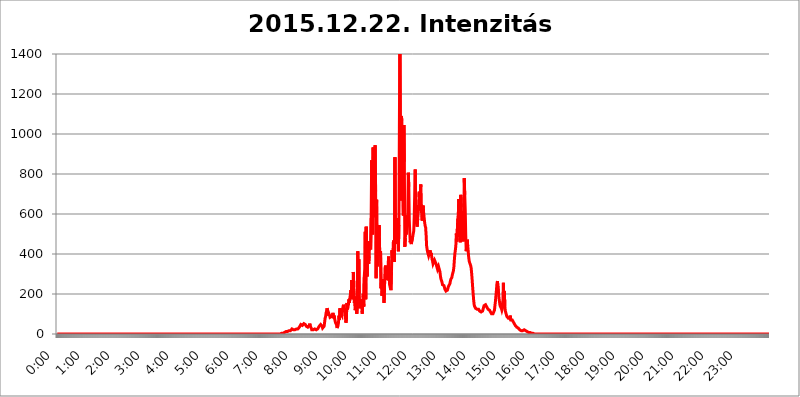
| Category | 2015.12.22. Intenzitás [W/m^2] |
|---|---|
| 0.0 | 0 |
| 0.0006944444444444445 | 0 |
| 0.001388888888888889 | 0 |
| 0.0020833333333333333 | 0 |
| 0.002777777777777778 | 0 |
| 0.003472222222222222 | 0 |
| 0.004166666666666667 | 0 |
| 0.004861111111111111 | 0 |
| 0.005555555555555556 | 0 |
| 0.0062499999999999995 | 0 |
| 0.006944444444444444 | 0 |
| 0.007638888888888889 | 0 |
| 0.008333333333333333 | 0 |
| 0.009027777777777779 | 0 |
| 0.009722222222222222 | 0 |
| 0.010416666666666666 | 0 |
| 0.011111111111111112 | 0 |
| 0.011805555555555555 | 0 |
| 0.012499999999999999 | 0 |
| 0.013194444444444444 | 0 |
| 0.013888888888888888 | 0 |
| 0.014583333333333332 | 0 |
| 0.015277777777777777 | 0 |
| 0.015972222222222224 | 0 |
| 0.016666666666666666 | 0 |
| 0.017361111111111112 | 0 |
| 0.018055555555555557 | 0 |
| 0.01875 | 0 |
| 0.019444444444444445 | 0 |
| 0.02013888888888889 | 0 |
| 0.020833333333333332 | 0 |
| 0.02152777777777778 | 0 |
| 0.022222222222222223 | 0 |
| 0.02291666666666667 | 0 |
| 0.02361111111111111 | 0 |
| 0.024305555555555556 | 0 |
| 0.024999999999999998 | 0 |
| 0.025694444444444447 | 0 |
| 0.02638888888888889 | 0 |
| 0.027083333333333334 | 0 |
| 0.027777777777777776 | 0 |
| 0.02847222222222222 | 0 |
| 0.029166666666666664 | 0 |
| 0.029861111111111113 | 0 |
| 0.030555555555555555 | 0 |
| 0.03125 | 0 |
| 0.03194444444444445 | 0 |
| 0.03263888888888889 | 0 |
| 0.03333333333333333 | 0 |
| 0.034027777777777775 | 0 |
| 0.034722222222222224 | 0 |
| 0.035416666666666666 | 0 |
| 0.036111111111111115 | 0 |
| 0.03680555555555556 | 0 |
| 0.0375 | 0 |
| 0.03819444444444444 | 0 |
| 0.03888888888888889 | 0 |
| 0.03958333333333333 | 0 |
| 0.04027777777777778 | 0 |
| 0.04097222222222222 | 0 |
| 0.041666666666666664 | 0 |
| 0.042361111111111106 | 0 |
| 0.04305555555555556 | 0 |
| 0.043750000000000004 | 0 |
| 0.044444444444444446 | 0 |
| 0.04513888888888889 | 0 |
| 0.04583333333333334 | 0 |
| 0.04652777777777778 | 0 |
| 0.04722222222222222 | 0 |
| 0.04791666666666666 | 0 |
| 0.04861111111111111 | 0 |
| 0.049305555555555554 | 0 |
| 0.049999999999999996 | 0 |
| 0.05069444444444445 | 0 |
| 0.051388888888888894 | 0 |
| 0.052083333333333336 | 0 |
| 0.05277777777777778 | 0 |
| 0.05347222222222222 | 0 |
| 0.05416666666666667 | 0 |
| 0.05486111111111111 | 0 |
| 0.05555555555555555 | 0 |
| 0.05625 | 0 |
| 0.05694444444444444 | 0 |
| 0.057638888888888885 | 0 |
| 0.05833333333333333 | 0 |
| 0.05902777777777778 | 0 |
| 0.059722222222222225 | 0 |
| 0.06041666666666667 | 0 |
| 0.061111111111111116 | 0 |
| 0.06180555555555556 | 0 |
| 0.0625 | 0 |
| 0.06319444444444444 | 0 |
| 0.06388888888888888 | 0 |
| 0.06458333333333334 | 0 |
| 0.06527777777777778 | 0 |
| 0.06597222222222222 | 0 |
| 0.06666666666666667 | 0 |
| 0.06736111111111111 | 0 |
| 0.06805555555555555 | 0 |
| 0.06874999999999999 | 0 |
| 0.06944444444444443 | 0 |
| 0.07013888888888889 | 0 |
| 0.07083333333333333 | 0 |
| 0.07152777777777779 | 0 |
| 0.07222222222222223 | 0 |
| 0.07291666666666667 | 0 |
| 0.07361111111111111 | 0 |
| 0.07430555555555556 | 0 |
| 0.075 | 0 |
| 0.07569444444444444 | 0 |
| 0.0763888888888889 | 0 |
| 0.07708333333333334 | 0 |
| 0.07777777777777778 | 0 |
| 0.07847222222222222 | 0 |
| 0.07916666666666666 | 0 |
| 0.0798611111111111 | 0 |
| 0.08055555555555556 | 0 |
| 0.08125 | 0 |
| 0.08194444444444444 | 0 |
| 0.08263888888888889 | 0 |
| 0.08333333333333333 | 0 |
| 0.08402777777777777 | 0 |
| 0.08472222222222221 | 0 |
| 0.08541666666666665 | 0 |
| 0.08611111111111112 | 0 |
| 0.08680555555555557 | 0 |
| 0.08750000000000001 | 0 |
| 0.08819444444444445 | 0 |
| 0.08888888888888889 | 0 |
| 0.08958333333333333 | 0 |
| 0.09027777777777778 | 0 |
| 0.09097222222222222 | 0 |
| 0.09166666666666667 | 0 |
| 0.09236111111111112 | 0 |
| 0.09305555555555556 | 0 |
| 0.09375 | 0 |
| 0.09444444444444444 | 0 |
| 0.09513888888888888 | 0 |
| 0.09583333333333333 | 0 |
| 0.09652777777777777 | 0 |
| 0.09722222222222222 | 0 |
| 0.09791666666666667 | 0 |
| 0.09861111111111111 | 0 |
| 0.09930555555555555 | 0 |
| 0.09999999999999999 | 0 |
| 0.10069444444444443 | 0 |
| 0.1013888888888889 | 0 |
| 0.10208333333333335 | 0 |
| 0.10277777777777779 | 0 |
| 0.10347222222222223 | 0 |
| 0.10416666666666667 | 0 |
| 0.10486111111111111 | 0 |
| 0.10555555555555556 | 0 |
| 0.10625 | 0 |
| 0.10694444444444444 | 0 |
| 0.1076388888888889 | 0 |
| 0.10833333333333334 | 0 |
| 0.10902777777777778 | 0 |
| 0.10972222222222222 | 0 |
| 0.1111111111111111 | 0 |
| 0.11180555555555556 | 0 |
| 0.11180555555555556 | 0 |
| 0.1125 | 0 |
| 0.11319444444444444 | 0 |
| 0.11388888888888889 | 0 |
| 0.11458333333333333 | 0 |
| 0.11527777777777777 | 0 |
| 0.11597222222222221 | 0 |
| 0.11666666666666665 | 0 |
| 0.1173611111111111 | 0 |
| 0.11805555555555557 | 0 |
| 0.11944444444444445 | 0 |
| 0.12013888888888889 | 0 |
| 0.12083333333333333 | 0 |
| 0.12152777777777778 | 0 |
| 0.12222222222222223 | 0 |
| 0.12291666666666667 | 0 |
| 0.12291666666666667 | 0 |
| 0.12361111111111112 | 0 |
| 0.12430555555555556 | 0 |
| 0.125 | 0 |
| 0.12569444444444444 | 0 |
| 0.12638888888888888 | 0 |
| 0.12708333333333333 | 0 |
| 0.16875 | 0 |
| 0.12847222222222224 | 0 |
| 0.12916666666666668 | 0 |
| 0.12986111111111112 | 0 |
| 0.13055555555555556 | 0 |
| 0.13125 | 0 |
| 0.13194444444444445 | 0 |
| 0.1326388888888889 | 0 |
| 0.13333333333333333 | 0 |
| 0.13402777777777777 | 0 |
| 0.13402777777777777 | 0 |
| 0.13472222222222222 | 0 |
| 0.13541666666666666 | 0 |
| 0.1361111111111111 | 0 |
| 0.13749999999999998 | 0 |
| 0.13819444444444443 | 0 |
| 0.1388888888888889 | 0 |
| 0.13958333333333334 | 0 |
| 0.14027777777777778 | 0 |
| 0.14097222222222222 | 0 |
| 0.14166666666666666 | 0 |
| 0.1423611111111111 | 0 |
| 0.14305555555555557 | 0 |
| 0.14375000000000002 | 0 |
| 0.14444444444444446 | 0 |
| 0.1451388888888889 | 0 |
| 0.1451388888888889 | 0 |
| 0.14652777777777778 | 0 |
| 0.14722222222222223 | 0 |
| 0.14791666666666667 | 0 |
| 0.1486111111111111 | 0 |
| 0.14930555555555555 | 0 |
| 0.15 | 0 |
| 0.15069444444444444 | 0 |
| 0.15138888888888888 | 0 |
| 0.15208333333333332 | 0 |
| 0.15277777777777776 | 0 |
| 0.15347222222222223 | 0 |
| 0.15416666666666667 | 0 |
| 0.15486111111111112 | 0 |
| 0.15555555555555556 | 0 |
| 0.15625 | 0 |
| 0.15694444444444444 | 0 |
| 0.15763888888888888 | 0 |
| 0.15833333333333333 | 0 |
| 0.15902777777777777 | 0 |
| 0.15972222222222224 | 0 |
| 0.16041666666666668 | 0 |
| 0.16111111111111112 | 0 |
| 0.16180555555555556 | 0 |
| 0.1625 | 0 |
| 0.16319444444444445 | 0 |
| 0.1638888888888889 | 0 |
| 0.16458333333333333 | 0 |
| 0.16527777777777777 | 0 |
| 0.16597222222222222 | 0 |
| 0.16666666666666666 | 0 |
| 0.1673611111111111 | 0 |
| 0.16805555555555554 | 0 |
| 0.16874999999999998 | 0 |
| 0.16944444444444443 | 0 |
| 0.17013888888888887 | 0 |
| 0.1708333333333333 | 0 |
| 0.17152777777777775 | 0 |
| 0.17222222222222225 | 0 |
| 0.1729166666666667 | 0 |
| 0.17361111111111113 | 0 |
| 0.17430555555555557 | 0 |
| 0.17500000000000002 | 0 |
| 0.17569444444444446 | 0 |
| 0.1763888888888889 | 0 |
| 0.17708333333333334 | 0 |
| 0.17777777777777778 | 0 |
| 0.17847222222222223 | 0 |
| 0.17916666666666667 | 0 |
| 0.1798611111111111 | 0 |
| 0.18055555555555555 | 0 |
| 0.18125 | 0 |
| 0.18194444444444444 | 0 |
| 0.1826388888888889 | 0 |
| 0.18333333333333335 | 0 |
| 0.1840277777777778 | 0 |
| 0.18472222222222223 | 0 |
| 0.18541666666666667 | 0 |
| 0.18611111111111112 | 0 |
| 0.18680555555555556 | 0 |
| 0.1875 | 0 |
| 0.18819444444444444 | 0 |
| 0.18888888888888888 | 0 |
| 0.18958333333333333 | 0 |
| 0.19027777777777777 | 0 |
| 0.1909722222222222 | 0 |
| 0.19166666666666665 | 0 |
| 0.19236111111111112 | 0 |
| 0.19305555555555554 | 0 |
| 0.19375 | 0 |
| 0.19444444444444445 | 0 |
| 0.1951388888888889 | 0 |
| 0.19583333333333333 | 0 |
| 0.19652777777777777 | 0 |
| 0.19722222222222222 | 0 |
| 0.19791666666666666 | 0 |
| 0.1986111111111111 | 0 |
| 0.19930555555555554 | 0 |
| 0.19999999999999998 | 0 |
| 0.20069444444444443 | 0 |
| 0.20138888888888887 | 0 |
| 0.2020833333333333 | 0 |
| 0.2027777777777778 | 0 |
| 0.2034722222222222 | 0 |
| 0.2041666666666667 | 0 |
| 0.20486111111111113 | 0 |
| 0.20555555555555557 | 0 |
| 0.20625000000000002 | 0 |
| 0.20694444444444446 | 0 |
| 0.2076388888888889 | 0 |
| 0.20833333333333334 | 0 |
| 0.20902777777777778 | 0 |
| 0.20972222222222223 | 0 |
| 0.21041666666666667 | 0 |
| 0.2111111111111111 | 0 |
| 0.21180555555555555 | 0 |
| 0.2125 | 0 |
| 0.21319444444444444 | 0 |
| 0.2138888888888889 | 0 |
| 0.21458333333333335 | 0 |
| 0.2152777777777778 | 0 |
| 0.21597222222222223 | 0 |
| 0.21666666666666667 | 0 |
| 0.21736111111111112 | 0 |
| 0.21805555555555556 | 0 |
| 0.21875 | 0 |
| 0.21944444444444444 | 0 |
| 0.22013888888888888 | 0 |
| 0.22083333333333333 | 0 |
| 0.22152777777777777 | 0 |
| 0.2222222222222222 | 0 |
| 0.22291666666666665 | 0 |
| 0.2236111111111111 | 0 |
| 0.22430555555555556 | 0 |
| 0.225 | 0 |
| 0.22569444444444445 | 0 |
| 0.2263888888888889 | 0 |
| 0.22708333333333333 | 0 |
| 0.22777777777777777 | 0 |
| 0.22847222222222222 | 0 |
| 0.22916666666666666 | 0 |
| 0.2298611111111111 | 0 |
| 0.23055555555555554 | 0 |
| 0.23124999999999998 | 0 |
| 0.23194444444444443 | 0 |
| 0.23263888888888887 | 0 |
| 0.2333333333333333 | 0 |
| 0.2340277777777778 | 0 |
| 0.2347222222222222 | 0 |
| 0.2354166666666667 | 0 |
| 0.23611111111111113 | 0 |
| 0.23680555555555557 | 0 |
| 0.23750000000000002 | 0 |
| 0.23819444444444446 | 0 |
| 0.2388888888888889 | 0 |
| 0.23958333333333334 | 0 |
| 0.24027777777777778 | 0 |
| 0.24097222222222223 | 0 |
| 0.24166666666666667 | 0 |
| 0.2423611111111111 | 0 |
| 0.24305555555555555 | 0 |
| 0.24375 | 0 |
| 0.24444444444444446 | 0 |
| 0.24513888888888888 | 0 |
| 0.24583333333333335 | 0 |
| 0.2465277777777778 | 0 |
| 0.24722222222222223 | 0 |
| 0.24791666666666667 | 0 |
| 0.24861111111111112 | 0 |
| 0.24930555555555556 | 0 |
| 0.25 | 0 |
| 0.25069444444444444 | 0 |
| 0.2513888888888889 | 0 |
| 0.2520833333333333 | 0 |
| 0.25277777777777777 | 0 |
| 0.2534722222222222 | 0 |
| 0.25416666666666665 | 0 |
| 0.2548611111111111 | 0 |
| 0.2555555555555556 | 0 |
| 0.25625000000000003 | 0 |
| 0.2569444444444445 | 0 |
| 0.2576388888888889 | 0 |
| 0.25833333333333336 | 0 |
| 0.2590277777777778 | 0 |
| 0.25972222222222224 | 0 |
| 0.2604166666666667 | 0 |
| 0.2611111111111111 | 0 |
| 0.26180555555555557 | 0 |
| 0.2625 | 0 |
| 0.26319444444444445 | 0 |
| 0.2638888888888889 | 0 |
| 0.26458333333333334 | 0 |
| 0.2652777777777778 | 0 |
| 0.2659722222222222 | 0 |
| 0.26666666666666666 | 0 |
| 0.2673611111111111 | 0 |
| 0.26805555555555555 | 0 |
| 0.26875 | 0 |
| 0.26944444444444443 | 0 |
| 0.2701388888888889 | 0 |
| 0.2708333333333333 | 0 |
| 0.27152777777777776 | 0 |
| 0.2722222222222222 | 0 |
| 0.27291666666666664 | 0 |
| 0.2736111111111111 | 0 |
| 0.2743055555555555 | 0 |
| 0.27499999999999997 | 0 |
| 0.27569444444444446 | 0 |
| 0.27638888888888885 | 0 |
| 0.27708333333333335 | 0 |
| 0.2777777777777778 | 0 |
| 0.27847222222222223 | 0 |
| 0.2791666666666667 | 0 |
| 0.2798611111111111 | 0 |
| 0.28055555555555556 | 0 |
| 0.28125 | 0 |
| 0.28194444444444444 | 0 |
| 0.2826388888888889 | 0 |
| 0.2833333333333333 | 0 |
| 0.28402777777777777 | 0 |
| 0.2847222222222222 | 0 |
| 0.28541666666666665 | 0 |
| 0.28611111111111115 | 0 |
| 0.28680555555555554 | 0 |
| 0.28750000000000003 | 0 |
| 0.2881944444444445 | 0 |
| 0.2888888888888889 | 0 |
| 0.28958333333333336 | 0 |
| 0.2902777777777778 | 0 |
| 0.29097222222222224 | 0 |
| 0.2916666666666667 | 0 |
| 0.2923611111111111 | 0 |
| 0.29305555555555557 | 0 |
| 0.29375 | 0 |
| 0.29444444444444445 | 0 |
| 0.2951388888888889 | 0 |
| 0.29583333333333334 | 0 |
| 0.2965277777777778 | 0 |
| 0.2972222222222222 | 0 |
| 0.29791666666666666 | 0 |
| 0.2986111111111111 | 0 |
| 0.29930555555555555 | 0 |
| 0.3 | 0 |
| 0.30069444444444443 | 0 |
| 0.3013888888888889 | 0 |
| 0.3020833333333333 | 0 |
| 0.30277777777777776 | 0 |
| 0.3034722222222222 | 0 |
| 0.30416666666666664 | 0 |
| 0.3048611111111111 | 0 |
| 0.3055555555555555 | 0 |
| 0.30624999999999997 | 0 |
| 0.3069444444444444 | 0 |
| 0.3076388888888889 | 0 |
| 0.30833333333333335 | 0 |
| 0.3090277777777778 | 0 |
| 0.30972222222222223 | 0 |
| 0.3104166666666667 | 0 |
| 0.3111111111111111 | 0 |
| 0.31180555555555556 | 0 |
| 0.3125 | 0 |
| 0.31319444444444444 | 3.525 |
| 0.3138888888888889 | 3.525 |
| 0.3145833333333333 | 3.525 |
| 0.31527777777777777 | 3.525 |
| 0.3159722222222222 | 3.525 |
| 0.31666666666666665 | 3.525 |
| 0.31736111111111115 | 3.525 |
| 0.31805555555555554 | 3.525 |
| 0.31875000000000003 | 7.887 |
| 0.3194444444444445 | 7.887 |
| 0.3201388888888889 | 12.257 |
| 0.32083333333333336 | 12.257 |
| 0.3215277777777778 | 12.257 |
| 0.32222222222222224 | 12.257 |
| 0.3229166666666667 | 12.257 |
| 0.3236111111111111 | 16.636 |
| 0.32430555555555557 | 16.636 |
| 0.325 | 16.636 |
| 0.32569444444444445 | 16.636 |
| 0.3263888888888889 | 16.636 |
| 0.32708333333333334 | 16.636 |
| 0.3277777777777778 | 21.024 |
| 0.3284722222222222 | 21.024 |
| 0.32916666666666666 | 25.419 |
| 0.3298611111111111 | 25.419 |
| 0.33055555555555555 | 21.024 |
| 0.33125 | 21.024 |
| 0.33194444444444443 | 21.024 |
| 0.3326388888888889 | 21.024 |
| 0.3333333333333333 | 21.024 |
| 0.3340277777777778 | 21.024 |
| 0.3347222222222222 | 21.024 |
| 0.3354166666666667 | 25.419 |
| 0.3361111111111111 | 25.419 |
| 0.3368055555555556 | 25.419 |
| 0.33749999999999997 | 25.419 |
| 0.33819444444444446 | 25.419 |
| 0.33888888888888885 | 29.823 |
| 0.33958333333333335 | 34.234 |
| 0.34027777777777773 | 34.234 |
| 0.34097222222222223 | 38.653 |
| 0.3416666666666666 | 47.511 |
| 0.3423611111111111 | 43.079 |
| 0.3430555555555555 | 43.079 |
| 0.34375 | 43.079 |
| 0.3444444444444445 | 38.653 |
| 0.3451388888888889 | 43.079 |
| 0.3458333333333334 | 51.951 |
| 0.34652777777777777 | 51.951 |
| 0.34722222222222227 | 51.951 |
| 0.34791666666666665 | 47.511 |
| 0.34861111111111115 | 47.511 |
| 0.34930555555555554 | 38.653 |
| 0.35000000000000003 | 38.653 |
| 0.3506944444444444 | 38.653 |
| 0.3513888888888889 | 34.234 |
| 0.3520833333333333 | 34.234 |
| 0.3527777777777778 | 38.653 |
| 0.3534722222222222 | 43.079 |
| 0.3541666666666667 | 51.951 |
| 0.3548611111111111 | 38.653 |
| 0.35555555555555557 | 38.653 |
| 0.35625 | 29.823 |
| 0.35694444444444445 | 21.024 |
| 0.3576388888888889 | 21.024 |
| 0.35833333333333334 | 21.024 |
| 0.3590277777777778 | 21.024 |
| 0.3597222222222222 | 25.419 |
| 0.36041666666666666 | 25.419 |
| 0.3611111111111111 | 25.419 |
| 0.36180555555555555 | 25.419 |
| 0.3625 | 21.024 |
| 0.36319444444444443 | 21.024 |
| 0.3638888888888889 | 25.419 |
| 0.3645833333333333 | 25.419 |
| 0.3652777777777778 | 25.419 |
| 0.3659722222222222 | 25.419 |
| 0.3666666666666667 | 29.823 |
| 0.3673611111111111 | 38.653 |
| 0.3680555555555556 | 43.079 |
| 0.36874999999999997 | 43.079 |
| 0.36944444444444446 | 47.511 |
| 0.37013888888888885 | 51.951 |
| 0.37083333333333335 | 47.511 |
| 0.37152777777777773 | 38.653 |
| 0.37222222222222223 | 29.823 |
| 0.3729166666666666 | 25.419 |
| 0.3736111111111111 | 25.419 |
| 0.3743055555555555 | 38.653 |
| 0.375 | 38.653 |
| 0.3756944444444445 | 78.722 |
| 0.3763888888888889 | 87.692 |
| 0.3770833333333334 | 105.69 |
| 0.37777777777777777 | 114.716 |
| 0.37847222222222227 | 128.284 |
| 0.37916666666666665 | 105.69 |
| 0.37986111111111115 | 92.184 |
| 0.38055555555555554 | 105.69 |
| 0.38125000000000003 | 110.201 |
| 0.3819444444444444 | 92.184 |
| 0.3826388888888889 | 83.205 |
| 0.3833333333333333 | 78.722 |
| 0.3840277777777778 | 83.205 |
| 0.3847222222222222 | 87.692 |
| 0.3854166666666667 | 83.205 |
| 0.3861111111111111 | 96.682 |
| 0.38680555555555557 | 105.69 |
| 0.3875 | 78.722 |
| 0.38819444444444445 | 92.184 |
| 0.3888888888888889 | 78.722 |
| 0.38958333333333334 | 78.722 |
| 0.3902777777777778 | 56.398 |
| 0.3909722222222222 | 56.398 |
| 0.39166666666666666 | 47.511 |
| 0.3923611111111111 | 29.823 |
| 0.39305555555555555 | 29.823 |
| 0.39375 | 43.079 |
| 0.39444444444444443 | 56.398 |
| 0.3951388888888889 | 92.184 |
| 0.3958333333333333 | 69.775 |
| 0.3965277777777778 | 128.284 |
| 0.3972222222222222 | 105.69 |
| 0.3979166666666667 | 110.201 |
| 0.3986111111111111 | 110.201 |
| 0.3993055555555556 | 92.184 |
| 0.39999999999999997 | 123.758 |
| 0.40069444444444446 | 132.814 |
| 0.40138888888888885 | 146.423 |
| 0.40208333333333335 | 150.964 |
| 0.40277777777777773 | 110.201 |
| 0.40347222222222223 | 128.284 |
| 0.4041666666666666 | 87.692 |
| 0.4048611111111111 | 56.398 |
| 0.4055555555555555 | 74.246 |
| 0.40625 | 155.509 |
| 0.4069444444444445 | 123.758 |
| 0.4076388888888889 | 132.814 |
| 0.4083333333333334 | 146.423 |
| 0.40902777777777777 | 173.709 |
| 0.40972222222222227 | 155.509 |
| 0.41041666666666665 | 178.264 |
| 0.41111111111111115 | 196.497 |
| 0.41180555555555554 | 219.309 |
| 0.41250000000000003 | 187.378 |
| 0.4131944444444444 | 269.49 |
| 0.4138888888888889 | 173.709 |
| 0.4145833333333333 | 187.378 |
| 0.4152777777777778 | 310.44 |
| 0.4159722222222222 | 233 |
| 0.4166666666666667 | 155.509 |
| 0.4173611111111111 | 173.709 |
| 0.41805555555555557 | 119.235 |
| 0.41875 | 155.509 |
| 0.41944444444444445 | 187.378 |
| 0.4201388888888889 | 101.184 |
| 0.42083333333333334 | 214.746 |
| 0.4215277777777778 | 414.035 |
| 0.4222222222222222 | 182.82 |
| 0.42291666666666666 | 373.729 |
| 0.4236111111111111 | 201.058 |
| 0.42430555555555555 | 128.284 |
| 0.425 | 173.709 |
| 0.42569444444444443 | 132.814 |
| 0.4263888888888889 | 155.509 |
| 0.4270833333333333 | 137.347 |
| 0.4277777777777778 | 101.184 |
| 0.4284722222222222 | 155.509 |
| 0.4291666666666667 | 201.058 |
| 0.4298611111111111 | 137.347 |
| 0.4305555555555556 | 283.156 |
| 0.43124999999999997 | 324.052 |
| 0.43194444444444446 | 510.885 |
| 0.43263888888888885 | 173.709 |
| 0.43333333333333335 | 536.82 |
| 0.43402777777777773 | 387.202 |
| 0.43472222222222223 | 287.709 |
| 0.4354166666666666 | 462.786 |
| 0.4361111111111111 | 409.574 |
| 0.4368055555555555 | 351.198 |
| 0.4375 | 387.202 |
| 0.4381944444444445 | 462.786 |
| 0.4388888888888889 | 440.702 |
| 0.4395833333333334 | 422.943 |
| 0.44027777777777777 | 579.542 |
| 0.44097222222222227 | 868.305 |
| 0.44166666666666665 | 731.896 |
| 0.44236111111111115 | 497.836 |
| 0.44305555555555554 | 932.576 |
| 0.44375000000000003 | 783.342 |
| 0.4444444444444444 | 583.779 |
| 0.4451388888888889 | 703.762 |
| 0.4458333333333333 | 943.832 |
| 0.4465277777777778 | 711.832 |
| 0.4472222222222222 | 278.603 |
| 0.4479166666666667 | 671.22 |
| 0.4486111111111111 | 337.639 |
| 0.44930555555555557 | 475.972 |
| 0.45 | 475.972 |
| 0.45069444444444445 | 414.035 |
| 0.4513888888888889 | 545.416 |
| 0.45208333333333334 | 436.27 |
| 0.4527777777777778 | 391.685 |
| 0.4534722222222222 | 414.035 |
| 0.45416666666666666 | 228.436 |
| 0.4548611111111111 | 274.047 |
| 0.45555555555555555 | 191.937 |
| 0.45625 | 228.436 |
| 0.45694444444444443 | 274.047 |
| 0.4576388888888889 | 201.058 |
| 0.4583333333333333 | 155.509 |
| 0.4590277777777778 | 233 |
| 0.4597222222222222 | 328.584 |
| 0.4604166666666667 | 342.162 |
| 0.4611111111111111 | 305.898 |
| 0.4618055555555556 | 269.49 |
| 0.46249999999999997 | 264.932 |
| 0.46319444444444446 | 287.709 |
| 0.46388888888888885 | 296.808 |
| 0.46458333333333335 | 387.202 |
| 0.46527777777777773 | 391.685 |
| 0.46597222222222223 | 251.251 |
| 0.4666666666666666 | 237.564 |
| 0.4673611111111111 | 228.436 |
| 0.4680555555555555 | 219.309 |
| 0.46875 | 310.44 |
| 0.4694444444444445 | 418.492 |
| 0.4701388888888889 | 373.729 |
| 0.4708333333333334 | 409.574 |
| 0.47152777777777777 | 467.187 |
| 0.47222222222222227 | 418.492 |
| 0.47291666666666665 | 360.221 |
| 0.47361111111111115 | 883.516 |
| 0.47430555555555554 | 541.121 |
| 0.47500000000000003 | 449.551 |
| 0.4756944444444444 | 523.88 |
| 0.4763888888888889 | 506.542 |
| 0.4770833333333333 | 536.82 |
| 0.4777777777777778 | 579.542 |
| 0.4784722222222222 | 414.035 |
| 0.4791666666666667 | 545.416 |
| 0.4798611111111111 | 1026.06 |
| 0.48055555555555557 | 1512.803 |
| 0.48125 | 1011.118 |
| 0.48194444444444445 | 667.123 |
| 0.4826388888888889 | 1089.873 |
| 0.48333333333333334 | 1067.267 |
| 0.4840277777777778 | 755.766 |
| 0.4847222222222222 | 687.544 |
| 0.48541666666666666 | 592.233 |
| 0.4861111111111111 | 1044.762 |
| 0.48680555555555555 | 860.676 |
| 0.4875 | 436.27 |
| 0.48819444444444443 | 480.356 |
| 0.4888888888888889 | 541.121 |
| 0.4895833333333333 | 497.836 |
| 0.4902777777777778 | 579.542 |
| 0.4909722222222222 | 575.299 |
| 0.4916666666666667 | 596.45 |
| 0.4923611111111111 | 806.757 |
| 0.4930555555555556 | 735.89 |
| 0.49374999999999997 | 566.793 |
| 0.49444444444444446 | 506.542 |
| 0.49513888888888885 | 458.38 |
| 0.49583333333333335 | 489.108 |
| 0.49652777777777773 | 449.551 |
| 0.49722222222222223 | 449.551 |
| 0.4979166666666666 | 453.968 |
| 0.4986111111111111 | 489.108 |
| 0.4993055555555555 | 484.735 |
| 0.5 | 515.223 |
| 0.5006944444444444 | 588.009 |
| 0.5013888888888889 | 588.009 |
| 0.5020833333333333 | 822.26 |
| 0.5027777777777778 | 562.53 |
| 0.5034722222222222 | 566.793 |
| 0.5041666666666667 | 549.704 |
| 0.5048611111111111 | 536.82 |
| 0.5055555555555555 | 575.299 |
| 0.50625 | 609.062 |
| 0.5069444444444444 | 650.667 |
| 0.5076388888888889 | 711.832 |
| 0.5083333333333333 | 642.4 |
| 0.5090277777777777 | 617.436 |
| 0.5097222222222222 | 747.834 |
| 0.5104166666666666 | 638.256 |
| 0.5111111111111112 | 634.105 |
| 0.5118055555555555 | 566.793 |
| 0.5125000000000001 | 621.613 |
| 0.5131944444444444 | 642.4 |
| 0.513888888888889 | 604.864 |
| 0.5145833333333333 | 604.864 |
| 0.5152777777777778 | 558.261 |
| 0.5159722222222222 | 541.121 |
| 0.5166666666666667 | 532.513 |
| 0.517361111111111 | 493.475 |
| 0.5180555555555556 | 440.702 |
| 0.5187499999999999 | 422.943 |
| 0.5194444444444445 | 409.574 |
| 0.5201388888888888 | 400.638 |
| 0.5208333333333334 | 391.685 |
| 0.5215277777777778 | 387.202 |
| 0.5222222222222223 | 387.202 |
| 0.5229166666666667 | 418.492 |
| 0.5236111111111111 | 396.164 |
| 0.5243055555555556 | 405.108 |
| 0.525 | 391.685 |
| 0.5256944444444445 | 373.729 |
| 0.5263888888888889 | 364.728 |
| 0.5270833333333333 | 351.198 |
| 0.5277777777777778 | 346.682 |
| 0.5284722222222222 | 355.712 |
| 0.5291666666666667 | 369.23 |
| 0.5298611111111111 | 369.23 |
| 0.5305555555555556 | 364.728 |
| 0.53125 | 351.198 |
| 0.5319444444444444 | 342.162 |
| 0.5326388888888889 | 333.113 |
| 0.5333333333333333 | 324.052 |
| 0.5340277777777778 | 328.584 |
| 0.5347222222222222 | 337.639 |
| 0.5354166666666667 | 337.639 |
| 0.5361111111111111 | 333.113 |
| 0.5368055555555555 | 310.44 |
| 0.5375 | 287.709 |
| 0.5381944444444444 | 274.047 |
| 0.5388888888888889 | 269.49 |
| 0.5395833333333333 | 260.373 |
| 0.5402777777777777 | 246.689 |
| 0.5409722222222222 | 242.127 |
| 0.5416666666666666 | 242.127 |
| 0.5423611111111112 | 242.127 |
| 0.5430555555555555 | 233 |
| 0.5437500000000001 | 223.873 |
| 0.5444444444444444 | 219.309 |
| 0.545138888888889 | 214.746 |
| 0.5458333333333333 | 214.746 |
| 0.5465277777777778 | 214.746 |
| 0.5472222222222222 | 219.309 |
| 0.5479166666666667 | 228.436 |
| 0.548611111111111 | 237.564 |
| 0.5493055555555556 | 242.127 |
| 0.5499999999999999 | 242.127 |
| 0.5506944444444445 | 251.251 |
| 0.5513888888888888 | 264.932 |
| 0.5520833333333334 | 274.047 |
| 0.5527777777777778 | 274.047 |
| 0.5534722222222223 | 283.156 |
| 0.5541666666666667 | 296.808 |
| 0.5548611111111111 | 305.898 |
| 0.5555555555555556 | 314.98 |
| 0.55625 | 333.113 |
| 0.5569444444444445 | 369.23 |
| 0.5576388888888889 | 400.638 |
| 0.5583333333333333 | 418.492 |
| 0.5590277777777778 | 440.702 |
| 0.5597222222222222 | 502.192 |
| 0.5604166666666667 | 462.786 |
| 0.5611111111111111 | 467.187 |
| 0.5618055555555556 | 575.299 |
| 0.5625 | 600.661 |
| 0.5631944444444444 | 675.311 |
| 0.5638888888888889 | 484.735 |
| 0.5645833333333333 | 596.45 |
| 0.5652777777777778 | 458.38 |
| 0.5659722222222222 | 695.666 |
| 0.5666666666666667 | 634.105 |
| 0.5673611111111111 | 541.121 |
| 0.5680555555555555 | 519.555 |
| 0.56875 | 471.582 |
| 0.5694444444444444 | 462.786 |
| 0.5701388888888889 | 489.108 |
| 0.5708333333333333 | 779.42 |
| 0.5715277777777777 | 695.666 |
| 0.5722222222222222 | 621.613 |
| 0.5729166666666666 | 493.475 |
| 0.5736111111111112 | 414.035 |
| 0.5743055555555555 | 414.035 |
| 0.5750000000000001 | 471.582 |
| 0.5756944444444444 | 440.702 |
| 0.576388888888889 | 414.035 |
| 0.5770833333333333 | 382.715 |
| 0.5777777777777778 | 364.728 |
| 0.5784722222222222 | 355.712 |
| 0.5791666666666667 | 351.198 |
| 0.579861111111111 | 342.162 |
| 0.5805555555555556 | 328.584 |
| 0.5812499999999999 | 301.354 |
| 0.5819444444444445 | 269.49 |
| 0.5826388888888888 | 233 |
| 0.5833333333333334 | 201.058 |
| 0.5840277777777778 | 169.156 |
| 0.5847222222222223 | 146.423 |
| 0.5854166666666667 | 137.347 |
| 0.5861111111111111 | 132.814 |
| 0.5868055555555556 | 128.284 |
| 0.5875 | 128.284 |
| 0.5881944444444445 | 128.284 |
| 0.5888888888888889 | 123.758 |
| 0.5895833333333333 | 123.758 |
| 0.5902777777777778 | 123.758 |
| 0.5909722222222222 | 123.758 |
| 0.5916666666666667 | 119.235 |
| 0.5923611111111111 | 114.716 |
| 0.5930555555555556 | 110.201 |
| 0.59375 | 110.201 |
| 0.5944444444444444 | 110.201 |
| 0.5951388888888889 | 105.69 |
| 0.5958333333333333 | 110.201 |
| 0.5965277777777778 | 114.716 |
| 0.5972222222222222 | 123.758 |
| 0.5979166666666667 | 132.814 |
| 0.5986111111111111 | 141.884 |
| 0.5993055555555555 | 141.884 |
| 0.6 | 146.423 |
| 0.6006944444444444 | 146.423 |
| 0.6013888888888889 | 141.884 |
| 0.6020833333333333 | 137.347 |
| 0.6027777777777777 | 137.347 |
| 0.6034722222222222 | 132.814 |
| 0.6041666666666666 | 123.758 |
| 0.6048611111111112 | 123.758 |
| 0.6055555555555555 | 119.235 |
| 0.6062500000000001 | 119.235 |
| 0.6069444444444444 | 119.235 |
| 0.607638888888889 | 110.201 |
| 0.6083333333333333 | 105.69 |
| 0.6090277777777778 | 101.184 |
| 0.6097222222222222 | 101.184 |
| 0.6104166666666667 | 101.184 |
| 0.611111111111111 | 101.184 |
| 0.6118055555555556 | 101.184 |
| 0.6124999999999999 | 105.69 |
| 0.6131944444444445 | 119.235 |
| 0.6138888888888888 | 141.884 |
| 0.6145833333333334 | 164.605 |
| 0.6152777777777778 | 191.937 |
| 0.6159722222222223 | 219.309 |
| 0.6166666666666667 | 251.251 |
| 0.6173611111111111 | 264.932 |
| 0.6180555555555556 | 260.373 |
| 0.61875 | 210.182 |
| 0.6194444444444445 | 182.82 |
| 0.6201388888888889 | 164.605 |
| 0.6208333333333333 | 146.423 |
| 0.6215277777777778 | 137.347 |
| 0.6222222222222222 | 141.884 |
| 0.6229166666666667 | 128.284 |
| 0.6236111111111111 | 119.235 |
| 0.6243055555555556 | 128.284 |
| 0.625 | 164.605 |
| 0.6256944444444444 | 255.813 |
| 0.6263888888888889 | 182.82 |
| 0.6270833333333333 | 214.746 |
| 0.6277777777777778 | 137.347 |
| 0.6284722222222222 | 114.716 |
| 0.6291666666666667 | 105.69 |
| 0.6298611111111111 | 96.682 |
| 0.6305555555555555 | 87.692 |
| 0.63125 | 92.184 |
| 0.6319444444444444 | 87.692 |
| 0.6326388888888889 | 78.722 |
| 0.6333333333333333 | 83.205 |
| 0.6340277777777777 | 78.722 |
| 0.6347222222222222 | 78.722 |
| 0.6354166666666666 | 92.184 |
| 0.6361111111111112 | 69.775 |
| 0.6368055555555555 | 69.775 |
| 0.6375000000000001 | 69.775 |
| 0.6381944444444444 | 69.775 |
| 0.638888888888889 | 65.31 |
| 0.6395833333333333 | 60.85 |
| 0.6402777777777778 | 60.85 |
| 0.6409722222222222 | 51.951 |
| 0.6416666666666667 | 47.511 |
| 0.642361111111111 | 43.079 |
| 0.6430555555555556 | 43.079 |
| 0.6437499999999999 | 38.653 |
| 0.6444444444444445 | 34.234 |
| 0.6451388888888888 | 29.823 |
| 0.6458333333333334 | 29.823 |
| 0.6465277777777778 | 29.823 |
| 0.6472222222222223 | 29.823 |
| 0.6479166666666667 | 25.419 |
| 0.6486111111111111 | 21.024 |
| 0.6493055555555556 | 21.024 |
| 0.65 | 21.024 |
| 0.6506944444444445 | 16.636 |
| 0.6513888888888889 | 16.636 |
| 0.6520833333333333 | 16.636 |
| 0.6527777777777778 | 16.636 |
| 0.6534722222222222 | 21.024 |
| 0.6541666666666667 | 21.024 |
| 0.6548611111111111 | 21.024 |
| 0.6555555555555556 | 21.024 |
| 0.65625 | 16.636 |
| 0.6569444444444444 | 16.636 |
| 0.6576388888888889 | 12.257 |
| 0.6583333333333333 | 12.257 |
| 0.6590277777777778 | 12.257 |
| 0.6597222222222222 | 7.887 |
| 0.6604166666666667 | 7.887 |
| 0.6611111111111111 | 7.887 |
| 0.6618055555555555 | 7.887 |
| 0.6625 | 7.887 |
| 0.6631944444444444 | 7.887 |
| 0.6638888888888889 | 3.525 |
| 0.6645833333333333 | 3.525 |
| 0.6652777777777777 | 3.525 |
| 0.6659722222222222 | 3.525 |
| 0.6666666666666666 | 3.525 |
| 0.6673611111111111 | 3.525 |
| 0.6680555555555556 | 3.525 |
| 0.6687500000000001 | 3.525 |
| 0.6694444444444444 | 0 |
| 0.6701388888888888 | 0 |
| 0.6708333333333334 | 0 |
| 0.6715277777777778 | 0 |
| 0.6722222222222222 | 0 |
| 0.6729166666666666 | 0 |
| 0.6736111111111112 | 0 |
| 0.6743055555555556 | 0 |
| 0.6749999999999999 | 0 |
| 0.6756944444444444 | 0 |
| 0.6763888888888889 | 0 |
| 0.6770833333333334 | 0 |
| 0.6777777777777777 | 0 |
| 0.6784722222222223 | 0 |
| 0.6791666666666667 | 0 |
| 0.6798611111111111 | 0 |
| 0.6805555555555555 | 0 |
| 0.68125 | 0 |
| 0.6819444444444445 | 0 |
| 0.6826388888888889 | 0 |
| 0.6833333333333332 | 0 |
| 0.6840277777777778 | 0 |
| 0.6847222222222222 | 0 |
| 0.6854166666666667 | 0 |
| 0.686111111111111 | 0 |
| 0.6868055555555556 | 0 |
| 0.6875 | 0 |
| 0.6881944444444444 | 0 |
| 0.688888888888889 | 0 |
| 0.6895833333333333 | 0 |
| 0.6902777777777778 | 0 |
| 0.6909722222222222 | 0 |
| 0.6916666666666668 | 0 |
| 0.6923611111111111 | 0 |
| 0.6930555555555555 | 0 |
| 0.69375 | 0 |
| 0.6944444444444445 | 0 |
| 0.6951388888888889 | 0 |
| 0.6958333333333333 | 0 |
| 0.6965277777777777 | 0 |
| 0.6972222222222223 | 0 |
| 0.6979166666666666 | 0 |
| 0.6986111111111111 | 0 |
| 0.6993055555555556 | 0 |
| 0.7000000000000001 | 0 |
| 0.7006944444444444 | 0 |
| 0.7013888888888888 | 0 |
| 0.7020833333333334 | 0 |
| 0.7027777777777778 | 0 |
| 0.7034722222222222 | 0 |
| 0.7041666666666666 | 0 |
| 0.7048611111111112 | 0 |
| 0.7055555555555556 | 0 |
| 0.7062499999999999 | 0 |
| 0.7069444444444444 | 0 |
| 0.7076388888888889 | 0 |
| 0.7083333333333334 | 0 |
| 0.7090277777777777 | 0 |
| 0.7097222222222223 | 0 |
| 0.7104166666666667 | 0 |
| 0.7111111111111111 | 0 |
| 0.7118055555555555 | 0 |
| 0.7125 | 0 |
| 0.7131944444444445 | 0 |
| 0.7138888888888889 | 0 |
| 0.7145833333333332 | 0 |
| 0.7152777777777778 | 0 |
| 0.7159722222222222 | 0 |
| 0.7166666666666667 | 0 |
| 0.717361111111111 | 0 |
| 0.7180555555555556 | 0 |
| 0.71875 | 0 |
| 0.7194444444444444 | 0 |
| 0.720138888888889 | 0 |
| 0.7208333333333333 | 0 |
| 0.7215277777777778 | 0 |
| 0.7222222222222222 | 0 |
| 0.7229166666666668 | 0 |
| 0.7236111111111111 | 0 |
| 0.7243055555555555 | 0 |
| 0.725 | 0 |
| 0.7256944444444445 | 0 |
| 0.7263888888888889 | 0 |
| 0.7270833333333333 | 0 |
| 0.7277777777777777 | 0 |
| 0.7284722222222223 | 0 |
| 0.7291666666666666 | 0 |
| 0.7298611111111111 | 0 |
| 0.7305555555555556 | 0 |
| 0.7312500000000001 | 0 |
| 0.7319444444444444 | 0 |
| 0.7326388888888888 | 0 |
| 0.7333333333333334 | 0 |
| 0.7340277777777778 | 0 |
| 0.7347222222222222 | 0 |
| 0.7354166666666666 | 0 |
| 0.7361111111111112 | 0 |
| 0.7368055555555556 | 0 |
| 0.7374999999999999 | 0 |
| 0.7381944444444444 | 0 |
| 0.7388888888888889 | 0 |
| 0.7395833333333334 | 0 |
| 0.7402777777777777 | 0 |
| 0.7409722222222223 | 0 |
| 0.7416666666666667 | 0 |
| 0.7423611111111111 | 0 |
| 0.7430555555555555 | 0 |
| 0.74375 | 0 |
| 0.7444444444444445 | 0 |
| 0.7451388888888889 | 0 |
| 0.7458333333333332 | 0 |
| 0.7465277777777778 | 0 |
| 0.7472222222222222 | 0 |
| 0.7479166666666667 | 0 |
| 0.748611111111111 | 0 |
| 0.7493055555555556 | 0 |
| 0.75 | 0 |
| 0.7506944444444444 | 0 |
| 0.751388888888889 | 0 |
| 0.7520833333333333 | 0 |
| 0.7527777777777778 | 0 |
| 0.7534722222222222 | 0 |
| 0.7541666666666668 | 0 |
| 0.7548611111111111 | 0 |
| 0.7555555555555555 | 0 |
| 0.75625 | 0 |
| 0.7569444444444445 | 0 |
| 0.7576388888888889 | 0 |
| 0.7583333333333333 | 0 |
| 0.7590277777777777 | 0 |
| 0.7597222222222223 | 0 |
| 0.7604166666666666 | 0 |
| 0.7611111111111111 | 0 |
| 0.7618055555555556 | 0 |
| 0.7625000000000001 | 0 |
| 0.7631944444444444 | 0 |
| 0.7638888888888888 | 0 |
| 0.7645833333333334 | 0 |
| 0.7652777777777778 | 0 |
| 0.7659722222222222 | 0 |
| 0.7666666666666666 | 0 |
| 0.7673611111111112 | 0 |
| 0.7680555555555556 | 0 |
| 0.7687499999999999 | 0 |
| 0.7694444444444444 | 0 |
| 0.7701388888888889 | 0 |
| 0.7708333333333334 | 0 |
| 0.7715277777777777 | 0 |
| 0.7722222222222223 | 0 |
| 0.7729166666666667 | 0 |
| 0.7736111111111111 | 0 |
| 0.7743055555555555 | 0 |
| 0.775 | 0 |
| 0.7756944444444445 | 0 |
| 0.7763888888888889 | 0 |
| 0.7770833333333332 | 0 |
| 0.7777777777777778 | 0 |
| 0.7784722222222222 | 0 |
| 0.7791666666666667 | 0 |
| 0.779861111111111 | 0 |
| 0.7805555555555556 | 0 |
| 0.78125 | 0 |
| 0.7819444444444444 | 0 |
| 0.782638888888889 | 0 |
| 0.7833333333333333 | 0 |
| 0.7840277777777778 | 0 |
| 0.7847222222222222 | 0 |
| 0.7854166666666668 | 0 |
| 0.7861111111111111 | 0 |
| 0.7868055555555555 | 0 |
| 0.7875 | 0 |
| 0.7881944444444445 | 0 |
| 0.7888888888888889 | 0 |
| 0.7895833333333333 | 0 |
| 0.7902777777777777 | 0 |
| 0.7909722222222223 | 0 |
| 0.7916666666666666 | 0 |
| 0.7923611111111111 | 0 |
| 0.7930555555555556 | 0 |
| 0.7937500000000001 | 0 |
| 0.7944444444444444 | 0 |
| 0.7951388888888888 | 0 |
| 0.7958333333333334 | 0 |
| 0.7965277777777778 | 0 |
| 0.7972222222222222 | 0 |
| 0.7979166666666666 | 0 |
| 0.7986111111111112 | 0 |
| 0.7993055555555556 | 0 |
| 0.7999999999999999 | 0 |
| 0.8006944444444444 | 0 |
| 0.8013888888888889 | 0 |
| 0.8020833333333334 | 0 |
| 0.8027777777777777 | 0 |
| 0.8034722222222223 | 0 |
| 0.8041666666666667 | 0 |
| 0.8048611111111111 | 0 |
| 0.8055555555555555 | 0 |
| 0.80625 | 0 |
| 0.8069444444444445 | 0 |
| 0.8076388888888889 | 0 |
| 0.8083333333333332 | 0 |
| 0.8090277777777778 | 0 |
| 0.8097222222222222 | 0 |
| 0.8104166666666667 | 0 |
| 0.811111111111111 | 0 |
| 0.8118055555555556 | 0 |
| 0.8125 | 0 |
| 0.8131944444444444 | 0 |
| 0.813888888888889 | 0 |
| 0.8145833333333333 | 0 |
| 0.8152777777777778 | 0 |
| 0.8159722222222222 | 0 |
| 0.8166666666666668 | 0 |
| 0.8173611111111111 | 0 |
| 0.8180555555555555 | 0 |
| 0.81875 | 0 |
| 0.8194444444444445 | 0 |
| 0.8201388888888889 | 0 |
| 0.8208333333333333 | 0 |
| 0.8215277777777777 | 0 |
| 0.8222222222222223 | 0 |
| 0.8229166666666666 | 0 |
| 0.8236111111111111 | 0 |
| 0.8243055555555556 | 0 |
| 0.8250000000000001 | 0 |
| 0.8256944444444444 | 0 |
| 0.8263888888888888 | 0 |
| 0.8270833333333334 | 0 |
| 0.8277777777777778 | 0 |
| 0.8284722222222222 | 0 |
| 0.8291666666666666 | 0 |
| 0.8298611111111112 | 0 |
| 0.8305555555555556 | 0 |
| 0.8312499999999999 | 0 |
| 0.8319444444444444 | 0 |
| 0.8326388888888889 | 0 |
| 0.8333333333333334 | 0 |
| 0.8340277777777777 | 0 |
| 0.8347222222222223 | 0 |
| 0.8354166666666667 | 0 |
| 0.8361111111111111 | 0 |
| 0.8368055555555555 | 0 |
| 0.8375 | 0 |
| 0.8381944444444445 | 0 |
| 0.8388888888888889 | 0 |
| 0.8395833333333332 | 0 |
| 0.8402777777777778 | 0 |
| 0.8409722222222222 | 0 |
| 0.8416666666666667 | 0 |
| 0.842361111111111 | 0 |
| 0.8430555555555556 | 0 |
| 0.84375 | 0 |
| 0.8444444444444444 | 0 |
| 0.845138888888889 | 0 |
| 0.8458333333333333 | 0 |
| 0.8465277777777778 | 0 |
| 0.8472222222222222 | 0 |
| 0.8479166666666668 | 0 |
| 0.8486111111111111 | 0 |
| 0.8493055555555555 | 0 |
| 0.85 | 0 |
| 0.8506944444444445 | 0 |
| 0.8513888888888889 | 0 |
| 0.8520833333333333 | 0 |
| 0.8527777777777777 | 0 |
| 0.8534722222222223 | 0 |
| 0.8541666666666666 | 0 |
| 0.8548611111111111 | 0 |
| 0.8555555555555556 | 0 |
| 0.8562500000000001 | 0 |
| 0.8569444444444444 | 0 |
| 0.8576388888888888 | 0 |
| 0.8583333333333334 | 0 |
| 0.8590277777777778 | 0 |
| 0.8597222222222222 | 0 |
| 0.8604166666666666 | 0 |
| 0.8611111111111112 | 0 |
| 0.8618055555555556 | 0 |
| 0.8624999999999999 | 0 |
| 0.8631944444444444 | 0 |
| 0.8638888888888889 | 0 |
| 0.8645833333333334 | 0 |
| 0.8652777777777777 | 0 |
| 0.8659722222222223 | 0 |
| 0.8666666666666667 | 0 |
| 0.8673611111111111 | 0 |
| 0.8680555555555555 | 0 |
| 0.86875 | 0 |
| 0.8694444444444445 | 0 |
| 0.8701388888888889 | 0 |
| 0.8708333333333332 | 0 |
| 0.8715277777777778 | 0 |
| 0.8722222222222222 | 0 |
| 0.8729166666666667 | 0 |
| 0.873611111111111 | 0 |
| 0.8743055555555556 | 0 |
| 0.875 | 0 |
| 0.8756944444444444 | 0 |
| 0.876388888888889 | 0 |
| 0.8770833333333333 | 0 |
| 0.8777777777777778 | 0 |
| 0.8784722222222222 | 0 |
| 0.8791666666666668 | 0 |
| 0.8798611111111111 | 0 |
| 0.8805555555555555 | 0 |
| 0.88125 | 0 |
| 0.8819444444444445 | 0 |
| 0.8826388888888889 | 0 |
| 0.8833333333333333 | 0 |
| 0.8840277777777777 | 0 |
| 0.8847222222222223 | 0 |
| 0.8854166666666666 | 0 |
| 0.8861111111111111 | 0 |
| 0.8868055555555556 | 0 |
| 0.8875000000000001 | 0 |
| 0.8881944444444444 | 0 |
| 0.8888888888888888 | 0 |
| 0.8895833333333334 | 0 |
| 0.8902777777777778 | 0 |
| 0.8909722222222222 | 0 |
| 0.8916666666666666 | 0 |
| 0.8923611111111112 | 0 |
| 0.8930555555555556 | 0 |
| 0.8937499999999999 | 0 |
| 0.8944444444444444 | 0 |
| 0.8951388888888889 | 0 |
| 0.8958333333333334 | 0 |
| 0.8965277777777777 | 0 |
| 0.8972222222222223 | 0 |
| 0.8979166666666667 | 0 |
| 0.8986111111111111 | 0 |
| 0.8993055555555555 | 0 |
| 0.9 | 0 |
| 0.9006944444444445 | 0 |
| 0.9013888888888889 | 0 |
| 0.9020833333333332 | 0 |
| 0.9027777777777778 | 0 |
| 0.9034722222222222 | 0 |
| 0.9041666666666667 | 0 |
| 0.904861111111111 | 0 |
| 0.9055555555555556 | 0 |
| 0.90625 | 0 |
| 0.9069444444444444 | 0 |
| 0.907638888888889 | 0 |
| 0.9083333333333333 | 0 |
| 0.9090277777777778 | 0 |
| 0.9097222222222222 | 0 |
| 0.9104166666666668 | 0 |
| 0.9111111111111111 | 0 |
| 0.9118055555555555 | 0 |
| 0.9125 | 0 |
| 0.9131944444444445 | 0 |
| 0.9138888888888889 | 0 |
| 0.9145833333333333 | 0 |
| 0.9152777777777777 | 0 |
| 0.9159722222222223 | 0 |
| 0.9166666666666666 | 0 |
| 0.9173611111111111 | 0 |
| 0.9180555555555556 | 0 |
| 0.9187500000000001 | 0 |
| 0.9194444444444444 | 0 |
| 0.9201388888888888 | 0 |
| 0.9208333333333334 | 0 |
| 0.9215277777777778 | 0 |
| 0.9222222222222222 | 0 |
| 0.9229166666666666 | 0 |
| 0.9236111111111112 | 0 |
| 0.9243055555555556 | 0 |
| 0.9249999999999999 | 0 |
| 0.9256944444444444 | 0 |
| 0.9263888888888889 | 0 |
| 0.9270833333333334 | 0 |
| 0.9277777777777777 | 0 |
| 0.9284722222222223 | 0 |
| 0.9291666666666667 | 0 |
| 0.9298611111111111 | 0 |
| 0.9305555555555555 | 0 |
| 0.93125 | 0 |
| 0.9319444444444445 | 0 |
| 0.9326388888888889 | 0 |
| 0.9333333333333332 | 0 |
| 0.9340277777777778 | 0 |
| 0.9347222222222222 | 0 |
| 0.9354166666666667 | 0 |
| 0.936111111111111 | 0 |
| 0.9368055555555556 | 0 |
| 0.9375 | 0 |
| 0.9381944444444444 | 0 |
| 0.938888888888889 | 0 |
| 0.9395833333333333 | 0 |
| 0.9402777777777778 | 0 |
| 0.9409722222222222 | 0 |
| 0.9416666666666668 | 0 |
| 0.9423611111111111 | 0 |
| 0.9430555555555555 | 0 |
| 0.94375 | 0 |
| 0.9444444444444445 | 0 |
| 0.9451388888888889 | 0 |
| 0.9458333333333333 | 0 |
| 0.9465277777777777 | 0 |
| 0.9472222222222223 | 0 |
| 0.9479166666666666 | 0 |
| 0.9486111111111111 | 0 |
| 0.9493055555555556 | 0 |
| 0.9500000000000001 | 0 |
| 0.9506944444444444 | 0 |
| 0.9513888888888888 | 0 |
| 0.9520833333333334 | 0 |
| 0.9527777777777778 | 0 |
| 0.9534722222222222 | 0 |
| 0.9541666666666666 | 0 |
| 0.9548611111111112 | 0 |
| 0.9555555555555556 | 0 |
| 0.9562499999999999 | 0 |
| 0.9569444444444444 | 0 |
| 0.9576388888888889 | 0 |
| 0.9583333333333334 | 0 |
| 0.9590277777777777 | 0 |
| 0.9597222222222223 | 0 |
| 0.9604166666666667 | 0 |
| 0.9611111111111111 | 0 |
| 0.9618055555555555 | 0 |
| 0.9625 | 0 |
| 0.9631944444444445 | 0 |
| 0.9638888888888889 | 0 |
| 0.9645833333333332 | 0 |
| 0.9652777777777778 | 0 |
| 0.9659722222222222 | 0 |
| 0.9666666666666667 | 0 |
| 0.967361111111111 | 0 |
| 0.9680555555555556 | 0 |
| 0.96875 | 0 |
| 0.9694444444444444 | 0 |
| 0.970138888888889 | 0 |
| 0.9708333333333333 | 0 |
| 0.9715277777777778 | 0 |
| 0.9722222222222222 | 0 |
| 0.9729166666666668 | 0 |
| 0.9736111111111111 | 0 |
| 0.9743055555555555 | 0 |
| 0.975 | 0 |
| 0.9756944444444445 | 0 |
| 0.9763888888888889 | 0 |
| 0.9770833333333333 | 0 |
| 0.9777777777777777 | 0 |
| 0.9784722222222223 | 0 |
| 0.9791666666666666 | 0 |
| 0.9798611111111111 | 0 |
| 0.9805555555555556 | 0 |
| 0.9812500000000001 | 0 |
| 0.9819444444444444 | 0 |
| 0.9826388888888888 | 0 |
| 0.9833333333333334 | 0 |
| 0.9840277777777778 | 0 |
| 0.9847222222222222 | 0 |
| 0.9854166666666666 | 0 |
| 0.9861111111111112 | 0 |
| 0.9868055555555556 | 0 |
| 0.9874999999999999 | 0 |
| 0.9881944444444444 | 0 |
| 0.9888888888888889 | 0 |
| 0.9895833333333334 | 0 |
| 0.9902777777777777 | 0 |
| 0.9909722222222223 | 0 |
| 0.9916666666666667 | 0 |
| 0.9923611111111111 | 0 |
| 0.9930555555555555 | 0 |
| 0.99375 | 0 |
| 0.9944444444444445 | 0 |
| 0.9951388888888889 | 0 |
| 0.9958333333333332 | 0 |
| 0.9965277777777778 | 0 |
| 0.9972222222222222 | 0 |
| 0.9979166666666667 | 0 |
| 0.998611111111111 | 0 |
| 0.9993055555555556 | 0 |